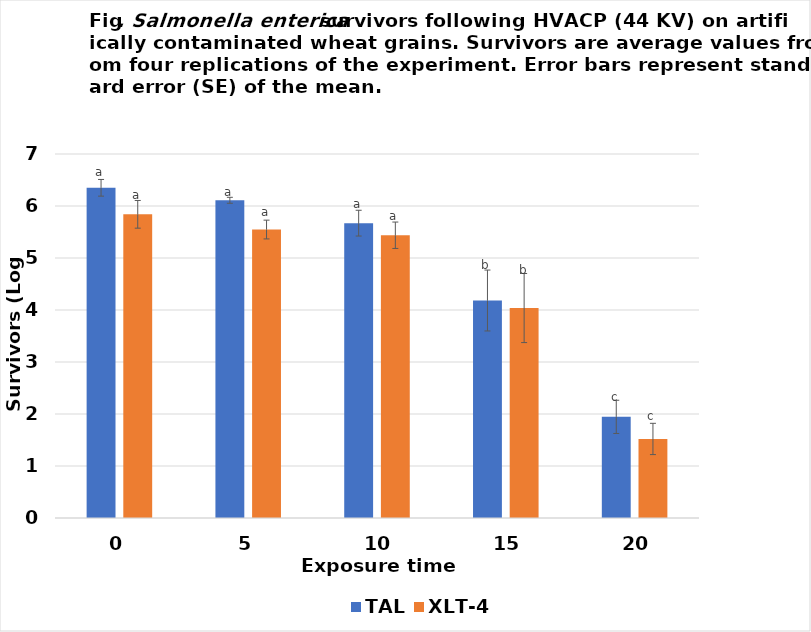
| Category | TAL | XLT-4 |
|---|---|---|
| 0.0 | 6.35 | 5.84 |
| 5.0 | 6.11 | 5.548 |
| 10.0 | 5.67 | 5.438 |
| 15.0 | 4.182 | 4.037 |
| 20.0 | 1.945 | 1.52 |